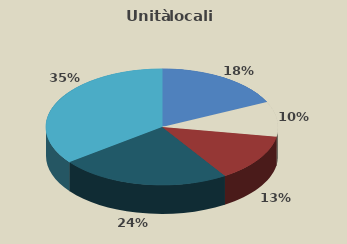
| Category | Series 0 |
|---|---|
| AGRICOLTURA | 7297 |
| INDUSTRIA | 3968 |
| COSTRUZIONI | 5382 |
| COMMERCIO | 9660 |
| ALTRI SERVIZI | 14387 |